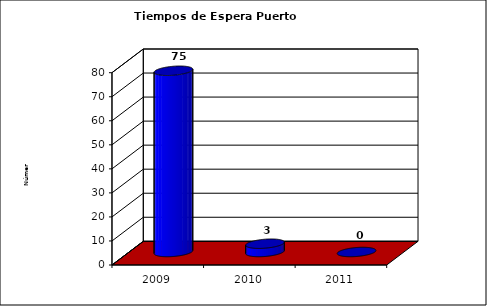
| Category | Series 0 |
|---|---|
| 2009.0 | 75.4 |
| 2010.0 | 3.45 |
| 2011.0 | 0 |